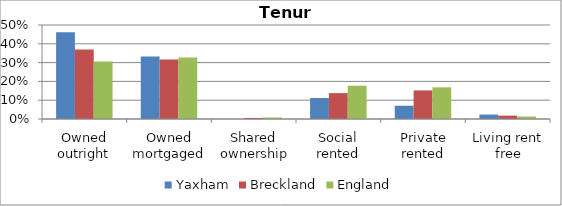
| Category | Yaxham | Breckland | England |
|---|---|---|---|
| Owned outright | 0.462 | 0.37 | 0.306 |
| Owned mortgaged | 0.332 | 0.317 | 0.328 |
| Shared ownership | 0 | 0.006 | 0.008 |
| Social rented | 0.112 | 0.138 | 0.177 |
| Private rented | 0.071 | 0.152 | 0.168 |
| Living rent free | 0.024 | 0.018 | 0.013 |